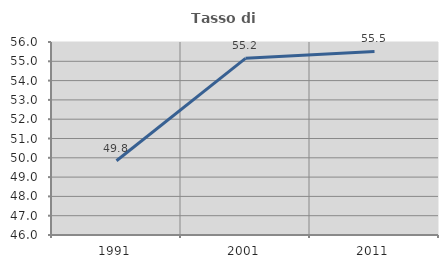
| Category | Tasso di occupazione   |
|---|---|
| 1991.0 | 49.845 |
| 2001.0 | 55.153 |
| 2011.0 | 55.512 |